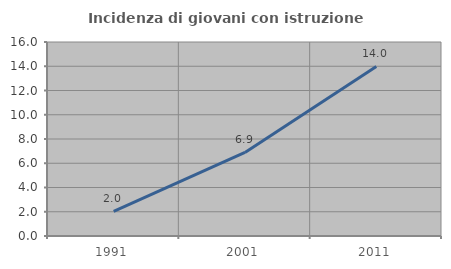
| Category | Incidenza di giovani con istruzione universitaria |
|---|---|
| 1991.0 | 2.024 |
| 2001.0 | 6.888 |
| 2011.0 | 13.983 |